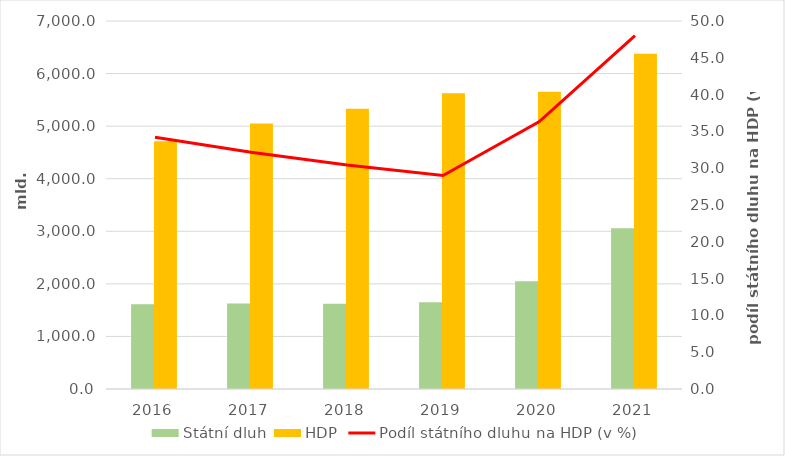
| Category | Státní dluh | HDP |
|---|---|---|
| 2016.0 | 1613.4 | 4715 |
| 2017.0 | 1624.7 | 5050 |
| 2018.0 | 1622 | 5329 |
| 2019.0 | 1650.5 | 5627 |
| 2020.0 | 2049.7 | 5652 |
| 2021.0 | 3060 | 6375 |